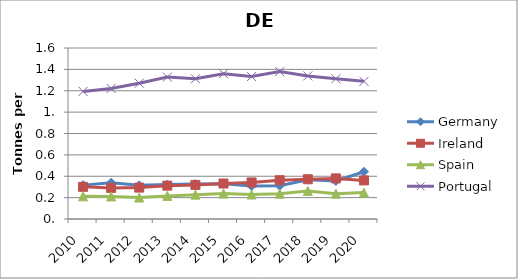
| Category | Germany | Ireland | Spain | Portugal |
|---|---|---|---|---|
| 2010 | 0.317 | 0.301 | 0.212 | 1.194 |
| 2011 | 0.339 | 0.291 | 0.211 | 1.222 |
| 2012 | 0.315 | 0.294 | 0.201 | 1.271 |
| 2013 | 0.322 | 0.312 | 0.216 | 1.328 |
| 2014 | 0.327 | 0.319 | 0.228 | 1.312 |
| 2015 | 0.33 | 0.332 | 0.238 | 1.36 |
| 2016 | 0.308 | 0.342 | 0.229 | 1.333 |
| 2017 | 0.311 | 0.363 | 0.237 | 1.379 |
| 2018 | 0.368 | 0.372 | 0.263 | 1.339 |
| 2019 | 0.356 | 0.38 | 0.237 | 1.312 |
| 2020 | 0.442 | 0.361 | 0.247 | 1.288 |